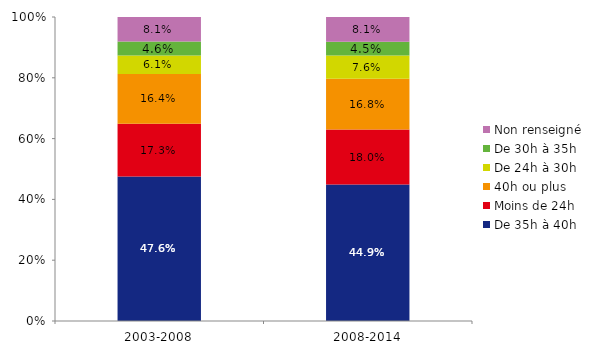
| Category | De 35h à 40h | Moins de 24h | 40h ou plus | De 24h à 30h | De 30h à 35h | Non renseigné |
|---|---|---|---|---|---|---|
| 2003-2008 | 0.476 | 0.173 | 0.164 | 0.061 | 0.046 | 0.081 |
| 2008-2014 | 0.449 | 0.18 | 0.168 | 0.076 | 0.045 | 0.081 |